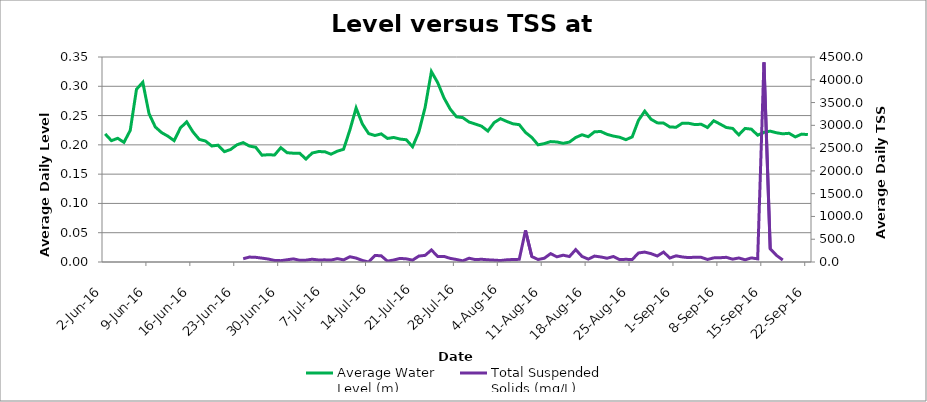
| Category | Average Water 
Level (m) |
|---|---|
| 2016-06-02 | 0.219 |
| 2016-06-03 | 0.207 |
| 2016-06-04 | 0.211 |
| 2016-06-05 | 0.204 |
| 2016-06-06 | 0.225 |
| 2016-06-07 | 0.295 |
| 2016-06-08 | 0.307 |
| 2016-06-09 | 0.253 |
| 2016-06-10 | 0.23 |
| 2016-06-11 | 0.221 |
| 2016-06-12 | 0.215 |
| 2016-06-13 | 0.207 |
| 2016-06-14 | 0.229 |
| 2016-06-15 | 0.239 |
| 2016-06-16 | 0.222 |
| 2016-06-17 | 0.209 |
| 2016-06-18 | 0.207 |
| 2016-06-19 | 0.198 |
| 2016-06-20 | 0.199 |
| 2016-06-21 | 0.188 |
| 2016-06-22 | 0.192 |
| 2016-06-23 | 0.2 |
| 2016-06-24 | 0.204 |
| 2016-06-25 | 0.198 |
| 2016-06-26 | 0.196 |
| 2016-06-27 | 0.182 |
| 2016-06-28 | 0.183 |
| 2016-06-29 | 0.183 |
| 2016-06-30 | 0.195 |
| 2016-07-01 | 0.187 |
| 2016-07-02 | 0.186 |
| 2016-07-03 | 0.186 |
| 2016-07-04 | 0.176 |
| 2016-07-05 | 0.186 |
| 2016-07-06 | 0.189 |
| 2016-07-07 | 0.188 |
| 2016-07-08 | 0.184 |
| 2016-07-09 | 0.189 |
| 2016-07-10 | 0.192 |
| 2016-07-11 | 0.225 |
| 2016-07-12 | 0.263 |
| 2016-07-13 | 0.236 |
| 2016-07-14 | 0.219 |
| 2016-07-15 | 0.216 |
| 2016-07-16 | 0.219 |
| 2016-07-17 | 0.211 |
| 2016-07-18 | 0.213 |
| 2016-07-19 | 0.21 |
| 2016-07-20 | 0.209 |
| 2016-07-21 | 0.197 |
| 2016-07-22 | 0.222 |
| 2016-07-23 | 0.264 |
| 2016-07-24 | 0.325 |
| 2016-07-25 | 0.306 |
| 2016-07-26 | 0.28 |
| 2016-07-27 | 0.261 |
| 2016-07-28 | 0.248 |
| 2016-07-29 | 0.246 |
| 2016-07-30 | 0.239 |
| 2016-07-31 | 0.236 |
| 2016-08-01 | 0.232 |
| 2016-08-02 | 0.224 |
| 2016-08-03 | 0.238 |
| 2016-08-04 | 0.245 |
| 2016-08-05 | 0.24 |
| 2016-08-06 | 0.236 |
| 2016-08-07 | 0.234 |
| 2016-08-08 | 0.221 |
| 2016-08-09 | 0.213 |
| 2016-08-10 | 0.2 |
| 2016-08-11 | 0.202 |
| 2016-08-12 | 0.206 |
| 2016-08-13 | 0.205 |
| 2016-08-14 | 0.203 |
| 2016-08-15 | 0.205 |
| 2016-08-16 | 0.213 |
| 2016-08-17 | 0.217 |
| 2016-08-18 | 0.214 |
| 2016-08-19 | 0.222 |
| 2016-08-20 | 0.223 |
| 2016-08-21 | 0.218 |
| 2016-08-22 | 0.215 |
| 2016-08-23 | 0.213 |
| 2016-08-24 | 0.209 |
| 2016-08-25 | 0.214 |
| 2016-08-26 | 0.242 |
| 2016-08-27 | 0.258 |
| 2016-08-28 | 0.244 |
| 2016-08-29 | 0.238 |
| 2016-08-30 | 0.237 |
| 2016-08-31 | 0.231 |
| 2016-09-01 | 0.23 |
| 2016-09-02 | 0.237 |
| 2016-09-03 | 0.237 |
| 2016-09-04 | 0.235 |
| 2016-09-05 | 0.235 |
| 2016-09-06 | 0.23 |
| 2016-09-07 | 0.241 |
| 2016-09-08 | 0.236 |
| 2016-09-09 | 0.23 |
| 2016-09-10 | 0.228 |
| 2016-09-11 | 0.217 |
| 2016-09-12 | 0.228 |
| 2016-09-13 | 0.227 |
| 2016-09-14 | 0.217 |
| 2016-09-15 | 0.221 |
| 2016-09-16 | 0.223 |
| 2016-09-17 | 0.221 |
| 2016-09-18 | 0.219 |
| 2016-09-19 | 0.22 |
| 2016-09-20 | 0.214 |
| 2016-09-21 | 0.218 |
| 2016-09-22 | 0.218 |